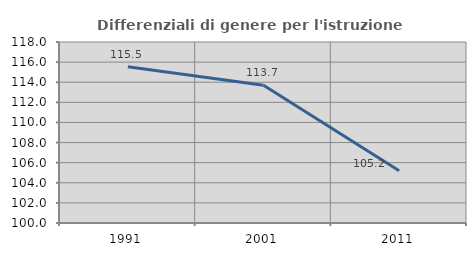
| Category | Differenziali di genere per l'istruzione superiore |
|---|---|
| 1991.0 | 115.549 |
| 2001.0 | 113.707 |
| 2011.0 | 105.188 |